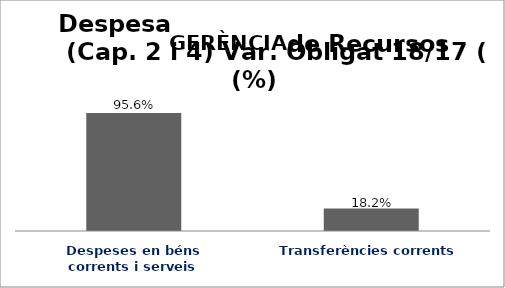
| Category | Series 0 |
|---|---|
| Despeses en béns corrents i serveis | 0.956 |
| Transferències corrents | 0.182 |